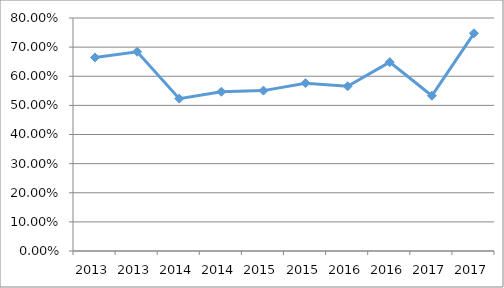
| Category | QUIM-N1O13 |
|---|---|
| 2013.0 | 0.665 |
| 2013.0 | 0.684 |
| 2014.0 | 0.523 |
| 2014.0 | 0.547 |
| 2015.0 | 0.551 |
| 2015.0 | 0.576 |
| 2016.0 | 0.566 |
| 2016.0 | 0.648 |
| 2017.0 | 0.533 |
| 2017.0 | 0.747 |